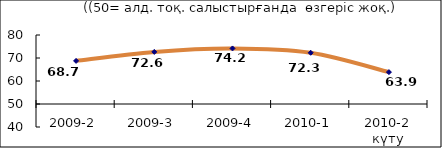
| Category | Диф.индекс ↓ |
|---|---|
| 2009-2 | 68.745 |
| 2009-3 | 72.645 |
| 2009-4 | 74.155 |
| 2010-1 | 72.27 |
| 2010-2 күту | 63.865 |